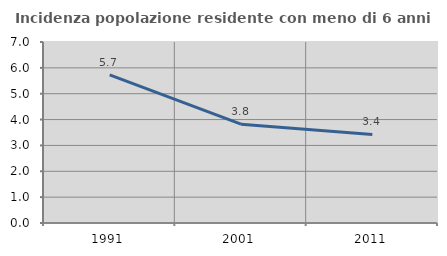
| Category | Incidenza popolazione residente con meno di 6 anni |
|---|---|
| 1991.0 | 5.73 |
| 2001.0 | 3.822 |
| 2011.0 | 3.427 |